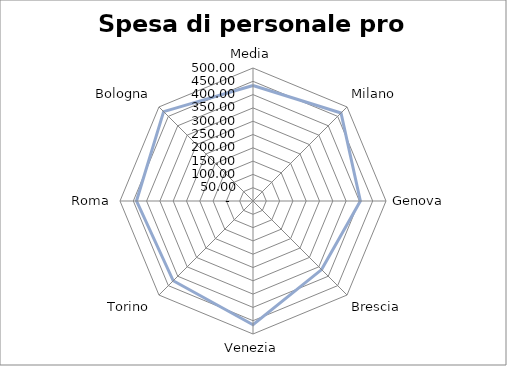
| Category | Spesa di personale pro capite  |
|---|---|
| Media | 434.104 |
| Milano | 467.88 |
| Genova | 403.66 |
| Brescia | 364.77 |
| Venezia | 465.2 |
| Torino | 424.05 |
| Roma | 438.04 |
| Bologna | 475.13 |